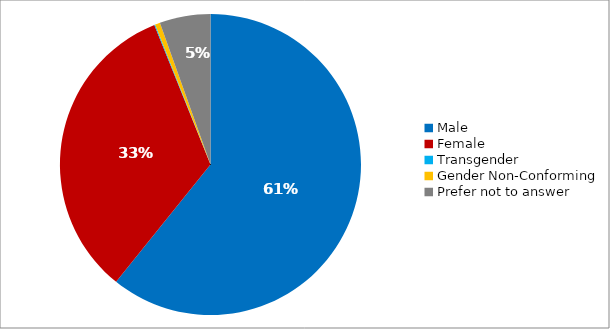
| Category | Responses |
|---|---|
| Male | 0.608 |
| Female | 0.331 |
| Transgender | 0.001 |
| Gender Non-Conforming | 0.005 |
| Prefer not to answer | 0.055 |